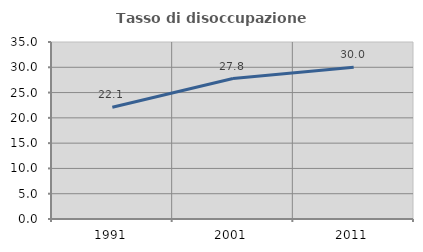
| Category | Tasso di disoccupazione giovanile  |
|---|---|
| 1991.0 | 22.093 |
| 2001.0 | 27.778 |
| 2011.0 | 30 |